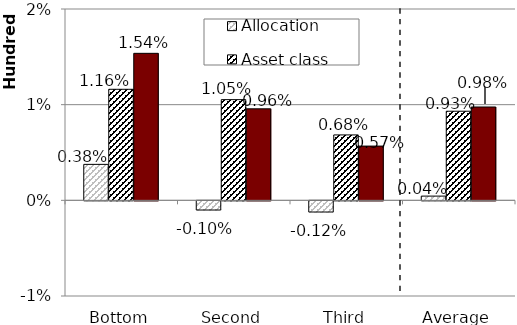
| Category | Allocation | Asset class returns | Total |
|---|---|---|---|
| Bottom | 0.376 | 1.161 | 1.537 |
| Second | -0.096 | 1.053 | 0.957 |
| Third | -0.117 | 0.684 | 0.567 |
| Average | 0.044 | 0.931 | 0.976 |